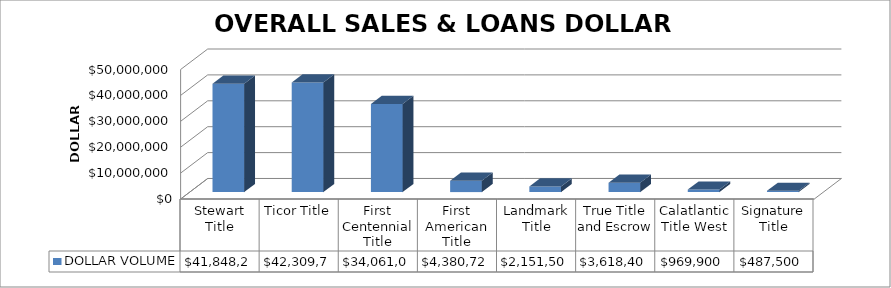
| Category | DOLLAR VOLUME |
|---|---|
| Stewart Title | 41848206.58 |
| Ticor Title | 42309700 |
| First Centennial Title | 34061000 |
| First American Title | 4380727 |
| Landmark Title | 2151504 |
| True Title and Escrow | 3618400 |
| Calatlantic Title West | 969900 |
| Signature Title | 487500 |